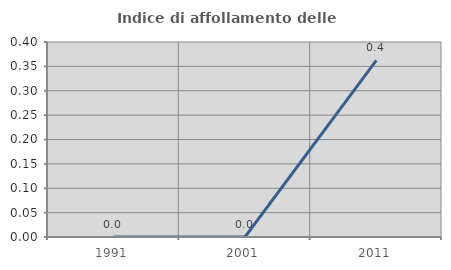
| Category | Indice di affollamento delle abitazioni  |
|---|---|
| 1991.0 | 0 |
| 2001.0 | 0 |
| 2011.0 | 0.362 |